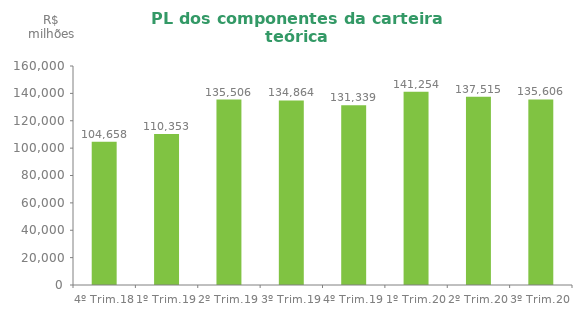
| Category | Series 0 |
|---|---|
| 4º Trim.18 | 104658.138 |
| 1º Trim.19 | 110353.048 |
| 2º Trim.19 | 135505.78 |
| 3º Trim.19 | 134863.51 |
| 4º Trim.19 | 131338.794 |
| 1º Trim.20 | 141254.49 |
| 2º Trim.20 | 137515.45 |
| 3º Trim.20 | 135605.88 |